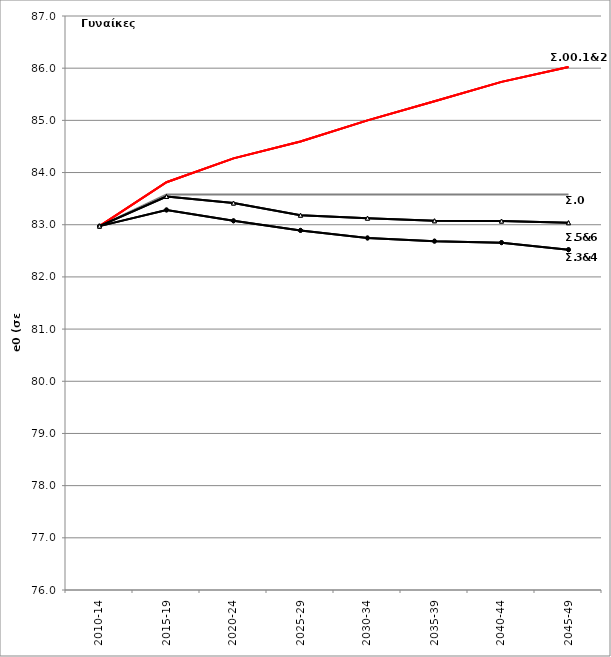
| Category | Σ0.e0 | Σ00.e0 | Σ1.e0 | Σ2.e0 | Σ3.e0 | Σ4.e0 | Σ5.e0 | Σ6.e0 |
|---|---|---|---|---|---|---|---|---|
| 2010-14 | 82.974 | 82.974 | 82.974 | 82.974 | 82.974 | 82.974 | 82.974 | 82.974 |
| 2015-19 | 83.579 | 83.814 | 83.814 | 83.814 | 83.283 | 83.283 | 83.541 | 83.541 |
| 2020-24 | 83.579 | 84.271 | 84.271 | 84.271 | 83.075 | 83.075 | 83.416 | 83.416 |
| 2025-29 | 83.579 | 84.596 | 84.596 | 84.596 | 82.892 | 82.892 | 83.182 | 83.182 |
| 2030-34 | 83.579 | 85 | 85 | 85 | 82.746 | 82.746 | 83.126 | 83.126 |
| 2035-39 | 83.579 | 85.367 | 85.367 | 85.367 | 82.686 | 82.686 | 83.075 | 83.075 |
| 2040-44 | 83.579 | 85.737 | 85.737 | 85.737 | 82.657 | 82.657 | 83.07 | 83.07 |
| 2045-49 | 83.579 | 86.024 | 86.024 | 86.024 | 82.521 | 82.521 | 83.039 | 83.039 |